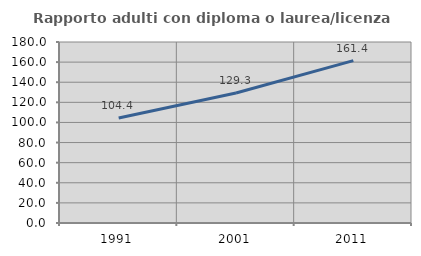
| Category | Rapporto adulti con diploma o laurea/licenza media  |
|---|---|
| 1991.0 | 104.358 |
| 2001.0 | 129.256 |
| 2011.0 | 161.436 |